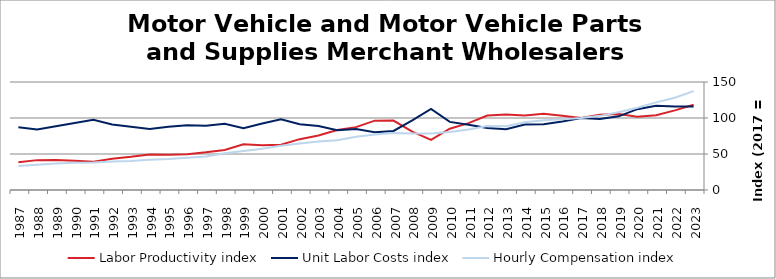
| Category | Labor Productivity index | Unit Labor Costs index | Hourly Compensation index |
|---|---|---|---|
| 2023.0 | 118.496 | 115.875 | 137.307 |
| 2022.0 | 110.631 | 115.814 | 128.127 |
| 2021.0 | 103.89 | 117.111 | 121.667 |
| 2020.0 | 101.8 | 112.257 | 114.278 |
| 2019.0 | 105.538 | 102.307 | 107.973 |
| 2018.0 | 104.451 | 98.579 | 102.967 |
| 2017.0 | 100 | 100 | 100 |
| 2016.0 | 103.185 | 95.059 | 98.087 |
| 2015.0 | 105.775 | 91.434 | 96.715 |
| 2014.0 | 103.379 | 90.91 | 93.982 |
| 2013.0 | 104.83 | 84.532 | 88.615 |
| 2012.0 | 103.489 | 86.016 | 89.018 |
| 2011.0 | 92.895 | 90.524 | 84.091 |
| 2010.0 | 85.141 | 94.599 | 80.542 |
| 2009.0 | 69.546 | 112.707 | 78.384 |
| 2008.0 | 81.166 | 96.81 | 78.577 |
| 2007.0 | 96.484 | 82.032 | 79.147 |
| 2006.0 | 96.302 | 80.207 | 77.241 |
| 2005.0 | 87.317 | 84.845 | 74.084 |
| 2004.0 | 83.238 | 82.922 | 69.023 |
| 2003.0 | 75.731 | 88.933 | 67.35 |
| 2002.0 | 70.61 | 91.417 | 64.55 |
| 2001.0 | 62.739 | 98.188 | 61.602 |
| 2000.0 | 62.047 | 92.404 | 57.334 |
| 1999.0 | 63.379 | 85.719 | 54.328 |
| 1998.0 | 55.652 | 91.838 | 51.11 |
| 1997.0 | 52.346 | 89.127 | 46.655 |
| 1996.0 | 49.804 | 89.882 | 44.765 |
| 1995.0 | 48.954 | 87.846 | 43.004 |
| 1994.0 | 49.41 | 84.841 | 41.92 |
| 1993.0 | 46.097 | 87.693 | 40.424 |
| 1992.0 | 43.556 | 90.869 | 39.579 |
| 1991.0 | 39.241 | 97.432 | 38.233 |
| 1990.0 | 40.57 | 93.031 | 37.743 |
| 1989.0 | 41.542 | 88.54 | 36.781 |
| 1988.0 | 41.486 | 84.13 | 34.902 |
| 1987.0 | 38.387 | 87.206 | 33.475 |